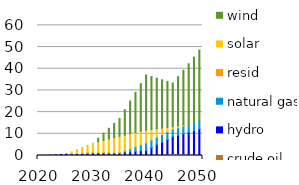
| Category | battery | crude oil | hydro | natural gas | resid | solar | wind |
|---|---|---|---|---|---|---|---|
| 2020.0 | 0 | 0 | 0 | 0 | 0 | 0 | 0 |
| 2021.0 | 0 | 0 | 0 | 0 | 0 | -0.001 | 0 |
| 2022.0 | 0 | 0 | 0.163 | 0 | 0 | -0.001 | 0 |
| 2023.0 | 0 | 0 | 0.326 | 0 | 0 | -0.001 | -0.001 |
| 2024.0 | 0 | 0 | 0.488 | 0 | 0 | -0.002 | -0.001 |
| 2025.0 | 0 | 0 | 0.651 | 0 | 0 | -0.002 | -0.002 |
| 2026.0 | 0 | 0 | 0.765 | 0 | 0.038 | 0.854 | -0.002 |
| 2027.0 | 0 | 0 | 0.879 | 0 | 0.075 | 1.71 | -0.002 |
| 2028.0 | 0 | 0 | 0.993 | 0 | 0.113 | 2.566 | -0.002 |
| 2029.0 | 0 | 0 | 1.107 | 0 | 0.151 | 3.422 | -0.002 |
| 2030.0 | 0 | 0 | 1.221 | 0 | 0.188 | 4.279 | -0.002 |
| 2031.0 | 0 | 0 | 1.221 | 0 | 0.151 | 4.954 | 1.642 |
| 2032.0 | 0 | 0 | 1.221 | 0 | 0.113 | 5.629 | 3.287 |
| 2033.0 | 0 | 0 | 1.221 | 0 | 0.075 | 6.304 | 4.931 |
| 2034.0 | 0 | 0 | 1.221 | 0 | 0.038 | 6.98 | 6.575 |
| 2035.0 | 0 | 0 | 1.221 | 0 | 0 | 7.655 | 8.219 |
| 2036.0 | 0 | 0.001 | 1.44 | 0.699 | 0 | 7.312 | 11.65 |
| 2037.0 | 0 | 0.001 | 1.658 | 1.398 | 0 | 6.97 | 15.08 |
| 2038.0 | 0 | 0.002 | 1.876 | 2.097 | 0 | 6.628 | 18.51 |
| 2039.0 | 0 | 0.002 | 2.094 | 2.797 | 0 | 6.286 | 21.941 |
| 2040.0 | 0 | 0.003 | 2.312 | 3.496 | 0 | 5.943 | 25.371 |
| 2041.0 | 0.178 | 0.003 | 3.394 | 3.496 | 0 | 4.985 | 24.327 |
| 2042.0 | 0.356 | 0.003 | 4.476 | 3.496 | 0 | 4.026 | 23.283 |
| 2043.0 | 0.534 | 0.003 | 5.557 | 3.496 | 0 | 3.068 | 22.238 |
| 2044.0 | 0.712 | 0.003 | 6.639 | 3.496 | 0 | 2.109 | 21.194 |
| 2045.0 | 0.89 | 0.003 | 7.721 | 3.496 | 0 | 1.151 | 20.15 |
| 2046.0 | 0.823 | 0.003 | 8.497 | 3.496 | 0 | 0.844 | 22.7 |
| 2047.0 | 0.757 | 0.003 | 9.272 | 3.496 | 0 | 0.538 | 25.251 |
| 2048.0 | 0.691 | 0.003 | 10.048 | 3.496 | 0 | 0.231 | 27.802 |
| 2049.0 | 0.625 | 0.003 | 10.824 | 3.496 | 0 | -0.076 | 30.353 |
| 2050.0 | 0.559 | 0.003 | 11.6 | 3.496 | 0 | -0.382 | 32.904 |